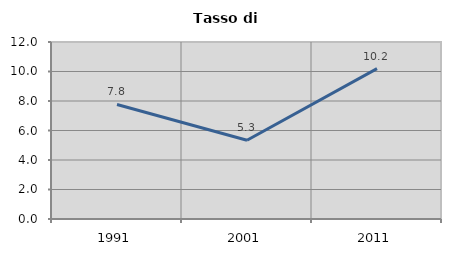
| Category | Tasso di disoccupazione   |
|---|---|
| 1991.0 | 7.764 |
| 2001.0 | 5.341 |
| 2011.0 | 10.191 |